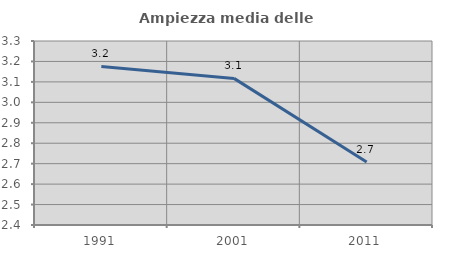
| Category | Ampiezza media delle famiglie |
|---|---|
| 1991.0 | 3.175 |
| 2001.0 | 3.117 |
| 2011.0 | 2.708 |